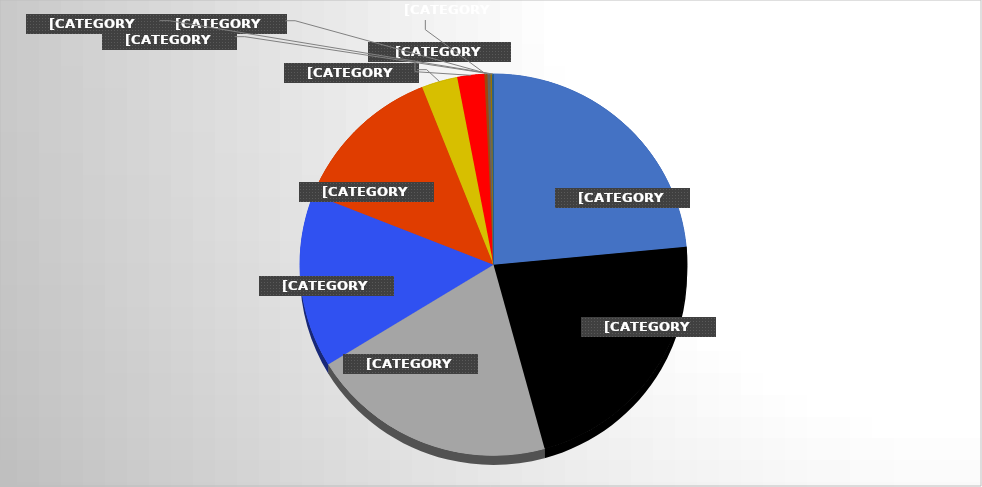
| Category | Series 0 |
|---|---|
| SEC 94% | 94 |
| Big 10 89% | 89 |
| ACC 82% | 82 |
| Pac-12 59% | 59 |
| Big 12 52% | 52 |
| Independent 12% | 12 |
| AAC 9% | 9 |
| Sun Belt 1% | 1 |
| MAC 1% | 1 |
| MWC 0.5% | 0.5 |
| C-USA 0.5% | 0.5 |